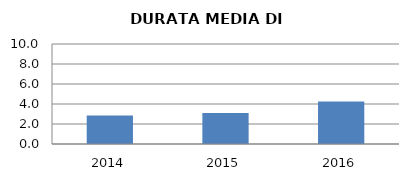
| Category | 2014 2015 2016 |
|---|---|
| 2014.0 | 2.857 |
| 2015.0 | 3.091 |
| 2016.0 | 4.25 |